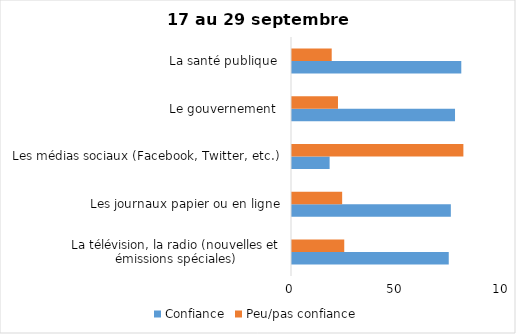
| Category | Confiance | Peu/pas confiance |
|---|---|---|
| La télévision, la radio (nouvelles et émissions spéciales) | 75 | 25 |
| Les journaux papier ou en ligne | 76 | 24 |
| Les médias sociaux (Facebook, Twitter, etc.) | 18 | 82 |
| Le gouvernement  | 78 | 22 |
| La santé publique  | 81 | 19 |